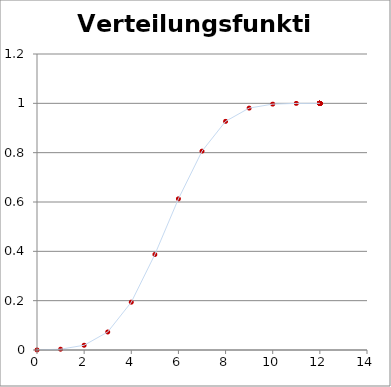
| Category | Verteilungsfunktion |
|---|---|
| 0.0 | 0 |
| 1.0 | 0.003 |
| 2.0 | 0.019 |
| 3.0 | 0.073 |
| 4.0 | 0.194 |
| 5.0 | 0.387 |
| 6.0 | 0.613 |
| 7.0 | 0.806 |
| 8.0 | 0.927 |
| 9.0 | 0.981 |
| 10.0 | 0.997 |
| 11.0 | 1 |
| 12.0 | 1 |
| 12.0 | 1 |
| 12.0 | 1 |
| 12.0 | 1 |
| 12.0 | 1 |
| 12.0 | 1 |
| 12.0 | 1 |
| 12.0 | 1 |
| 12.0 | 1 |
| 12.0 | 1 |
| 12.0 | 1 |
| 12.0 | 1 |
| 12.0 | 1 |
| 12.0 | 1 |
| 12.0 | 1 |
| 12.0 | 1 |
| 12.0 | 1 |
| 12.0 | 1 |
| 12.0 | 1 |
| 12.0 | 1 |
| 12.0 | 1 |
| 12.0 | 1 |
| 12.0 | 1 |
| 12.0 | 1 |
| 12.0 | 1 |
| 12.0 | 1 |
| 12.0 | 1 |
| 12.0 | 1 |
| 12.0 | 1 |
| 12.0 | 1 |
| 12.0 | 1 |
| 12.0 | 1 |
| 12.0 | 1 |
| 12.0 | 1 |
| 12.0 | 1 |
| 12.0 | 1 |
| 12.0 | 1 |
| 12.0 | 1 |
| 12.0 | 1 |
| 12.0 | 1 |
| 12.0 | 1 |
| 12.0 | 1 |
| 12.0 | 1 |
| 12.0 | 1 |
| 12.0 | 1 |
| 12.0 | 1 |
| 12.0 | 1 |
| 12.0 | 1 |
| 12.0 | 1 |
| 12.0 | 1 |
| 12.0 | 1 |
| 12.0 | 1 |
| 12.0 | 1 |
| 12.0 | 1 |
| 12.0 | 1 |
| 12.0 | 1 |
| 12.0 | 1 |
| 12.0 | 1 |
| 12.0 | 1 |
| 12.0 | 1 |
| 12.0 | 1 |
| 12.0 | 1 |
| 12.0 | 1 |
| 12.0 | 1 |
| 12.0 | 1 |
| 12.0 | 1 |
| 12.0 | 1 |
| 12.0 | 1 |
| 12.0 | 1 |
| 12.0 | 1 |
| 12.0 | 1 |
| 12.0 | 1 |
| 12.0 | 1 |
| 12.0 | 1 |
| 12.0 | 1 |
| 12.0 | 1 |
| 12.0 | 1 |
| 12.0 | 1 |
| 12.0 | 1 |
| 12.0 | 1 |
| 12.0 | 1 |
| 12.0 | 1 |
| 12.0 | 1 |
| 12.0 | 1 |
| 12.0 | 1 |
| 12.0 | 1 |
| 12.0 | 1 |
| 12.0 | 1 |
| 12.0 | 1 |
| 12.0 | 1 |
| 12.0 | 1 |
| 12.0 | 1 |
| 12.0 | 1 |
| 12.0 | 1 |
| 12.0 | 1 |
| 12.0 | 1 |
| 12.0 | 1 |
| 12.0 | 1 |
| 12.0 | 1 |
| 12.0 | 1 |
| 12.0 | 1 |
| 12.0 | 1 |
| 12.0 | 1 |
| 12.0 | 1 |
| 12.0 | 1 |
| 12.0 | 1 |
| 12.0 | 1 |
| 12.0 | 1 |
| 12.0 | 1 |
| 12.0 | 1 |
| 12.0 | 1 |
| 12.0 | 1 |
| 12.0 | 1 |
| 12.0 | 1 |
| 12.0 | 1 |
| 12.0 | 1 |
| 12.0 | 1 |
| 12.0 | 1 |
| 12.0 | 1 |
| 12.0 | 1 |
| 12.0 | 1 |
| 12.0 | 1 |
| 12.0 | 1 |
| 12.0 | 1 |
| 12.0 | 1 |
| 12.0 | 1 |
| 12.0 | 1 |
| 12.0 | 1 |
| 12.0 | 1 |
| 12.0 | 1 |
| 12.0 | 1 |
| 12.0 | 1 |
| 12.0 | 1 |
| 12.0 | 1 |
| 12.0 | 1 |
| 12.0 | 1 |
| 12.0 | 1 |
| 12.0 | 1 |
| 12.0 | 1 |
| 12.0 | 1 |
| 12.0 | 1 |
| 12.0 | 1 |
| 12.0 | 1 |
| 12.0 | 1 |
| 12.0 | 1 |
| 12.0 | 1 |
| 12.0 | 1 |
| 12.0 | 1 |
| 12.0 | 1 |
| 12.0 | 1 |
| 12.0 | 1 |
| 12.0 | 1 |
| 12.0 | 1 |
| 12.0 | 1 |
| 12.0 | 1 |
| 12.0 | 1 |
| 12.0 | 1 |
| 12.0 | 1 |
| 12.0 | 1 |
| 12.0 | 1 |
| 12.0 | 1 |
| 12.0 | 1 |
| 12.0 | 1 |
| 12.0 | 1 |
| 12.0 | 1 |
| 12.0 | 1 |
| 12.0 | 1 |
| 12.0 | 1 |
| 12.0 | 1 |
| 12.0 | 1 |
| 12.0 | 1 |
| 12.0 | 1 |
| 12.0 | 1 |
| 12.0 | 1 |
| 12.0 | 1 |
| 12.0 | 1 |
| 12.0 | 1 |
| 12.0 | 1 |
| 12.0 | 1 |
| 12.0 | 1 |
| 12.0 | 1 |
| 12.0 | 1 |
| 12.0 | 1 |
| 12.0 | 1 |
| 12.0 | 1 |
| 12.0 | 1 |
| 12.0 | 1 |
| 12.0 | 1 |
| 12.0 | 1 |
| 12.0 | 1 |
| 12.0 | 1 |
| 12.0 | 1 |
| 12.0 | 1 |
| 12.0 | 1 |
| 12.0 | 1 |
| 12.0 | 1 |
| 12.0 | 1 |
| 12.0 | 1 |
| 12.0 | 1 |
| 12.0 | 1 |
| 12.0 | 1 |
| 12.0 | 1 |
| 12.0 | 1 |
| 12.0 | 1 |
| 12.0 | 1 |
| 12.0 | 1 |
| 12.0 | 1 |
| 12.0 | 1 |
| 12.0 | 1 |
| 12.0 | 1 |
| 12.0 | 1 |
| 12.0 | 1 |
| 12.0 | 1 |
| 12.0 | 1 |
| 12.0 | 1 |
| 12.0 | 1 |
| 12.0 | 1 |
| 12.0 | 1 |
| 12.0 | 1 |
| 12.0 | 1 |
| 12.0 | 1 |
| 12.0 | 1 |
| 12.0 | 1 |
| 12.0 | 1 |
| 12.0 | 1 |
| 12.0 | 1 |
| 12.0 | 1 |
| 12.0 | 1 |
| 12.0 | 1 |
| 12.0 | 1 |
| 12.0 | 1 |
| 12.0 | 1 |
| 12.0 | 1 |
| 12.0 | 1 |
| 12.0 | 1 |
| 12.0 | 1 |
| 12.0 | 1 |
| 12.0 | 1 |
| 12.0 | 1 |
| 12.0 | 1 |
| 12.0 | 1 |
| 12.0 | 1 |
| 12.0 | 1 |
| 12.0 | 1 |
| 12.0 | 1 |
| 12.0 | 1 |
| 12.0 | 1 |
| 12.0 | 1 |
| 12.0 | 1 |
| 12.0 | 1 |
| 12.0 | 1 |
| 12.0 | 1 |
| 12.0 | 1 |
| 12.0 | 1 |
| 12.0 | 1 |
| 12.0 | 1 |
| 12.0 | 1 |
| 12.0 | 1 |
| 12.0 | 1 |
| 12.0 | 1 |
| 12.0 | 1 |
| 12.0 | 1 |
| 12.0 | 1 |
| 12.0 | 1 |
| 12.0 | 1 |
| 12.0 | 1 |
| 12.0 | 1 |
| 12.0 | 1 |
| 12.0 | 1 |
| 12.0 | 1 |
| 12.0 | 1 |
| 12.0 | 1 |
| 12.0 | 1 |
| 12.0 | 1 |
| 12.0 | 1 |
| 12.0 | 1 |
| 12.0 | 1 |
| 12.0 | 1 |
| 12.0 | 1 |
| 12.0 | 1 |
| 12.0 | 1 |
| 12.0 | 1 |
| 12.0 | 1 |
| 12.0 | 1 |
| 12.0 | 1 |
| 12.0 | 1 |
| 12.0 | 1 |
| 12.0 | 1 |
| 12.0 | 1 |
| 12.0 | 1 |
| 12.0 | 1 |
| 12.0 | 1 |
| 12.0 | 1 |
| 12.0 | 1 |
| 12.0 | 1 |
| 12.0 | 1 |
| 12.0 | 1 |
| 12.0 | 1 |
| 12.0 | 1 |
| 12.0 | 1 |
| 12.0 | 1 |
| 12.0 | 1 |
| 12.0 | 1 |
| 12.0 | 1 |
| 12.0 | 1 |
| 12.0 | 1 |
| 12.0 | 1 |
| 12.0 | 1 |
| 12.0 | 1 |
| 12.0 | 1 |
| 12.0 | 1 |
| 12.0 | 1 |
| 12.0 | 1 |
| 12.0 | 1 |
| 12.0 | 1 |
| 12.0 | 1 |
| 12.0 | 1 |
| 12.0 | 1 |
| 12.0 | 1 |
| 12.0 | 1 |
| 12.0 | 1 |
| 12.0 | 1 |
| 12.0 | 1 |
| 12.0 | 1 |
| 12.0 | 1 |
| 12.0 | 1 |
| 12.0 | 1 |
| 12.0 | 1 |
| 12.0 | 1 |
| 12.0 | 1 |
| 12.0 | 1 |
| 12.0 | 1 |
| 12.0 | 1 |
| 12.0 | 1 |
| 12.0 | 1 |
| 12.0 | 1 |
| 12.0 | 1 |
| 12.0 | 1 |
| 12.0 | 1 |
| 12.0 | 1 |
| 12.0 | 1 |
| 12.0 | 1 |
| 12.0 | 1 |
| 12.0 | 1 |
| 12.0 | 1 |
| 12.0 | 1 |
| 12.0 | 1 |
| 12.0 | 1 |
| 12.0 | 1 |
| 12.0 | 1 |
| 12.0 | 1 |
| 12.0 | 1 |
| 12.0 | 1 |
| 12.0 | 1 |
| 12.0 | 1 |
| 12.0 | 1 |
| 12.0 | 1 |
| 12.0 | 1 |
| 12.0 | 1 |
| 12.0 | 1 |
| 12.0 | 1 |
| 12.0 | 1 |
| 12.0 | 1 |
| 12.0 | 1 |
| 12.0 | 1 |
| 12.0 | 1 |
| 12.0 | 1 |
| 12.0 | 1 |
| 12.0 | 1 |
| 12.0 | 1 |
| 12.0 | 1 |
| 12.0 | 1 |
| 12.0 | 1 |
| 12.0 | 1 |
| 12.0 | 1 |
| 12.0 | 1 |
| 12.0 | 1 |
| 12.0 | 1 |
| 12.0 | 1 |
| 12.0 | 1 |
| 12.0 | 1 |
| 12.0 | 1 |
| 12.0 | 1 |
| 12.0 | 1 |
| 12.0 | 1 |
| 12.0 | 1 |
| 12.0 | 1 |
| 12.0 | 1 |
| 12.0 | 1 |
| 12.0 | 1 |
| 12.0 | 1 |
| 12.0 | 1 |
| 12.0 | 1 |
| 12.0 | 1 |
| 12.0 | 1 |
| 12.0 | 1 |
| 12.0 | 1 |
| 12.0 | 1 |
| 12.0 | 1 |
| 12.0 | 1 |
| 12.0 | 1 |
| 12.0 | 1 |
| 12.0 | 1 |
| 12.0 | 1 |
| 12.0 | 1 |
| 12.0 | 1 |
| 12.0 | 1 |
| 12.0 | 1 |
| 12.0 | 1 |
| 12.0 | 1 |
| 12.0 | 1 |
| 12.0 | 1 |
| 12.0 | 1 |
| 12.0 | 1 |
| 12.0 | 1 |
| 12.0 | 1 |
| 12.0 | 1 |
| 12.0 | 1 |
| 12.0 | 1 |
| 12.0 | 1 |
| 12.0 | 1 |
| 12.0 | 1 |
| 12.0 | 1 |
| 12.0 | 1 |
| 12.0 | 1 |
| 12.0 | 1 |
| 12.0 | 1 |
| 12.0 | 1 |
| 12.0 | 1 |
| 12.0 | 1 |
| 12.0 | 1 |
| 12.0 | 1 |
| 12.0 | 1 |
| 12.0 | 1 |
| 12.0 | 1 |
| 12.0 | 1 |
| 12.0 | 1 |
| 12.0 | 1 |
| 12.0 | 1 |
| 12.0 | 1 |
| 12.0 | 1 |
| 12.0 | 1 |
| 12.0 | 1 |
| 12.0 | 1 |
| 12.0 | 1 |
| 12.0 | 1 |
| 12.0 | 1 |
| 12.0 | 1 |
| 12.0 | 1 |
| 12.0 | 1 |
| 12.0 | 1 |
| 12.0 | 1 |
| 12.0 | 1 |
| 12.0 | 1 |
| 12.0 | 1 |
| 12.0 | 1 |
| 12.0 | 1 |
| 12.0 | 1 |
| 12.0 | 1 |
| 12.0 | 1 |
| 12.0 | 1 |
| 12.0 | 1 |
| 12.0 | 1 |
| 12.0 | 1 |
| 12.0 | 1 |
| 12.0 | 1 |
| 12.0 | 1 |
| 12.0 | 1 |
| 12.0 | 1 |
| 12.0 | 1 |
| 12.0 | 1 |
| 12.0 | 1 |
| 12.0 | 1 |
| 12.0 | 1 |
| 12.0 | 1 |
| 12.0 | 1 |
| 12.0 | 1 |
| 12.0 | 1 |
| 12.0 | 1 |
| 12.0 | 1 |
| 12.0 | 1 |
| 12.0 | 1 |
| 12.0 | 1 |
| 12.0 | 1 |
| 12.0 | 1 |
| 12.0 | 1 |
| 12.0 | 1 |
| 12.0 | 1 |
| 12.0 | 1 |
| 12.0 | 1 |
| 12.0 | 1 |
| 12.0 | 1 |
| 12.0 | 1 |
| 12.0 | 1 |
| 12.0 | 1 |
| 12.0 | 1 |
| 12.0 | 1 |
| 12.0 | 1 |
| 12.0 | 1 |
| 12.0 | 1 |
| 12.0 | 1 |
| 12.0 | 1 |
| 12.0 | 1 |
| 12.0 | 1 |
| 12.0 | 1 |
| 12.0 | 1 |
| 12.0 | 1 |
| 12.0 | 1 |
| 12.0 | 1 |
| 12.0 | 1 |
| 12.0 | 1 |
| 12.0 | 1 |
| 12.0 | 1 |
| 12.0 | 1 |
| 12.0 | 1 |
| 12.0 | 1 |
| 12.0 | 1 |
| 12.0 | 1 |
| 12.0 | 1 |
| 12.0 | 1 |
| 12.0 | 1 |
| 12.0 | 1 |
| 12.0 | 1 |
| 12.0 | 1 |
| 12.0 | 1 |
| 12.0 | 1 |
| 12.0 | 1 |
| 12.0 | 1 |
| 12.0 | 1 |
| 12.0 | 1 |
| 12.0 | 1 |
| 12.0 | 1 |
| 12.0 | 1 |
| 12.0 | 1 |
| 12.0 | 1 |
| 12.0 | 1 |
| 12.0 | 1 |
| 12.0 | 1 |
| 12.0 | 1 |
| 12.0 | 1 |
| 12.0 | 1 |
| 12.0 | 1 |
| 12.0 | 1 |
| 12.0 | 1 |
| 12.0 | 1 |
| 12.0 | 1 |
| 12.0 | 1 |
| 12.0 | 1 |
| 12.0 | 1 |
| 12.0 | 1 |
| 12.0 | 1 |
| 12.0 | 1 |
| 12.0 | 1 |
| 12.0 | 1 |
| 12.0 | 1 |
| 12.0 | 1 |
| 12.0 | 1 |
| 12.0 | 1 |
| 12.0 | 1 |
| 12.0 | 1 |
| 12.0 | 1 |
| 12.0 | 1 |
| 12.0 | 1 |
| 12.0 | 1 |
| 12.0 | 1 |
| 12.0 | 1 |
| 12.0 | 1 |
| 12.0 | 1 |
| 12.0 | 1 |
| 12.0 | 1 |
| 12.0 | 1 |
| 12.0 | 1 |
| 12.0 | 1 |
| 12.0 | 1 |
| 12.0 | 1 |
| 12.0 | 1 |
| 12.0 | 1 |
| 12.0 | 1 |
| 12.0 | 1 |
| 12.0 | 1 |
| 12.0 | 1 |
| 12.0 | 1 |
| 12.0 | 1 |
| 12.0 | 1 |
| 12.0 | 1 |
| 12.0 | 1 |
| 12.0 | 1 |
| 12.0 | 1 |
| 12.0 | 1 |
| 12.0 | 1 |
| 12.0 | 1 |
| 12.0 | 1 |
| 12.0 | 1 |
| 12.0 | 1 |
| 12.0 | 1 |
| 12.0 | 1 |
| 12.0 | 1 |
| 12.0 | 1 |
| 12.0 | 1 |
| 12.0 | 1 |
| 12.0 | 1 |
| 12.0 | 1 |
| 12.0 | 1 |
| 12.0 | 1 |
| 12.0 | 1 |
| 12.0 | 1 |
| 12.0 | 1 |
| 12.0 | 1 |
| 12.0 | 1 |
| 12.0 | 1 |
| 12.0 | 1 |
| 12.0 | 1 |
| 12.0 | 1 |
| 12.0 | 1 |
| 12.0 | 1 |
| 12.0 | 1 |
| 12.0 | 1 |
| 12.0 | 1 |
| 12.0 | 1 |
| 12.0 | 1 |
| 12.0 | 1 |
| 12.0 | 1 |
| 12.0 | 1 |
| 12.0 | 1 |
| 12.0 | 1 |
| 12.0 | 1 |
| 12.0 | 1 |
| 12.0 | 1 |
| 12.0 | 1 |
| 12.0 | 1 |
| 12.0 | 1 |
| 12.0 | 1 |
| 12.0 | 1 |
| 12.0 | 1 |
| 12.0 | 1 |
| 12.0 | 1 |
| 12.0 | 1 |
| 12.0 | 1 |
| 12.0 | 1 |
| 12.0 | 1 |
| 12.0 | 1 |
| 12.0 | 1 |
| 12.0 | 1 |
| 12.0 | 1 |
| 12.0 | 1 |
| 12.0 | 1 |
| 12.0 | 1 |
| 12.0 | 1 |
| 12.0 | 1 |
| 12.0 | 1 |
| 12.0 | 1 |
| 12.0 | 1 |
| 12.0 | 1 |
| 12.0 | 1 |
| 12.0 | 1 |
| 12.0 | 1 |
| 12.0 | 1 |
| 12.0 | 1 |
| 12.0 | 1 |
| 12.0 | 1 |
| 12.0 | 1 |
| 12.0 | 1 |
| 12.0 | 1 |
| 12.0 | 1 |
| 12.0 | 1 |
| 12.0 | 1 |
| 12.0 | 1 |
| 12.0 | 1 |
| 12.0 | 1 |
| 12.0 | 1 |
| 12.0 | 1 |
| 12.0 | 1 |
| 12.0 | 1 |
| 12.0 | 1 |
| 12.0 | 1 |
| 12.0 | 1 |
| 12.0 | 1 |
| 12.0 | 1 |
| 12.0 | 1 |
| 12.0 | 1 |
| 12.0 | 1 |
| 12.0 | 1 |
| 12.0 | 1 |
| 12.0 | 1 |
| 12.0 | 1 |
| 12.0 | 1 |
| 12.0 | 1 |
| 12.0 | 1 |
| 12.0 | 1 |
| 12.0 | 1 |
| 12.0 | 1 |
| 12.0 | 1 |
| 12.0 | 1 |
| 12.0 | 1 |
| 12.0 | 1 |
| 12.0 | 1 |
| 12.0 | 1 |
| 12.0 | 1 |
| 12.0 | 1 |
| 12.0 | 1 |
| 12.0 | 1 |
| 12.0 | 1 |
| 12.0 | 1 |
| 12.0 | 1 |
| 12.0 | 1 |
| 12.0 | 1 |
| 12.0 | 1 |
| 12.0 | 1 |
| 12.0 | 1 |
| 12.0 | 1 |
| 12.0 | 1 |
| 12.0 | 1 |
| 12.0 | 1 |
| 12.0 | 1 |
| 12.0 | 1 |
| 12.0 | 1 |
| 12.0 | 1 |
| 12.0 | 1 |
| 12.0 | 1 |
| 12.0 | 1 |
| 12.0 | 1 |
| 12.0 | 1 |
| 12.0 | 1 |
| 12.0 | 1 |
| 12.0 | 1 |
| 12.0 | 1 |
| 12.0 | 1 |
| 12.0 | 1 |
| 12.0 | 1 |
| 12.0 | 1 |
| 12.0 | 1 |
| 12.0 | 1 |
| 12.0 | 1 |
| 12.0 | 1 |
| 12.0 | 1 |
| 12.0 | 1 |
| 12.0 | 1 |
| 12.0 | 1 |
| 12.0 | 1 |
| 12.0 | 1 |
| 12.0 | 1 |
| 12.0 | 1 |
| 12.0 | 1 |
| 12.0 | 1 |
| 12.0 | 1 |
| 12.0 | 1 |
| 12.0 | 1 |
| 12.0 | 1 |
| 12.0 | 1 |
| 12.0 | 1 |
| 12.0 | 1 |
| 12.0 | 1 |
| 12.0 | 1 |
| 12.0 | 1 |
| 12.0 | 1 |
| 12.0 | 1 |
| 12.0 | 1 |
| 12.0 | 1 |
| 12.0 | 1 |
| 12.0 | 1 |
| 12.0 | 1 |
| 12.0 | 1 |
| 12.0 | 1 |
| 12.0 | 1 |
| 12.0 | 1 |
| 12.0 | 1 |
| 12.0 | 1 |
| 12.0 | 1 |
| 12.0 | 1 |
| 12.0 | 1 |
| 12.0 | 1 |
| 12.0 | 1 |
| 12.0 | 1 |
| 12.0 | 1 |
| 12.0 | 1 |
| 12.0 | 1 |
| 12.0 | 1 |
| 12.0 | 1 |
| 12.0 | 1 |
| 12.0 | 1 |
| 12.0 | 1 |
| 12.0 | 1 |
| 12.0 | 1 |
| 12.0 | 1 |
| 12.0 | 1 |
| 12.0 | 1 |
| 12.0 | 1 |
| 12.0 | 1 |
| 12.0 | 1 |
| 12.0 | 1 |
| 12.0 | 1 |
| 12.0 | 1 |
| 12.0 | 1 |
| 12.0 | 1 |
| 12.0 | 1 |
| 12.0 | 1 |
| 12.0 | 1 |
| 12.0 | 1 |
| 12.0 | 1 |
| 12.0 | 1 |
| 12.0 | 1 |
| 12.0 | 1 |
| 12.0 | 1 |
| 12.0 | 1 |
| 12.0 | 1 |
| 12.0 | 1 |
| 12.0 | 1 |
| 12.0 | 1 |
| 12.0 | 1 |
| 12.0 | 1 |
| 12.0 | 1 |
| 12.0 | 1 |
| 12.0 | 1 |
| 12.0 | 1 |
| 12.0 | 1 |
| 12.0 | 1 |
| 12.0 | 1 |
| 12.0 | 1 |
| 12.0 | 1 |
| 12.0 | 1 |
| 12.0 | 1 |
| 12.0 | 1 |
| 12.0 | 1 |
| 12.0 | 1 |
| 12.0 | 1 |
| 12.0 | 1 |
| 12.0 | 1 |
| 12.0 | 1 |
| 12.0 | 1 |
| 12.0 | 1 |
| 12.0 | 1 |
| 12.0 | 1 |
| 12.0 | 1 |
| 12.0 | 1 |
| 12.0 | 1 |
| 12.0 | 1 |
| 12.0 | 1 |
| 12.0 | 1 |
| 12.0 | 1 |
| 12.0 | 1 |
| 12.0 | 1 |
| 12.0 | 1 |
| 12.0 | 1 |
| 12.0 | 1 |
| 12.0 | 1 |
| 12.0 | 1 |
| 12.0 | 1 |
| 12.0 | 1 |
| 12.0 | 1 |
| 12.0 | 1 |
| 12.0 | 1 |
| 12.0 | 1 |
| 12.0 | 1 |
| 12.0 | 1 |
| 12.0 | 1 |
| 12.0 | 1 |
| 12.0 | 1 |
| 12.0 | 1 |
| 12.0 | 1 |
| 12.0 | 1 |
| 12.0 | 1 |
| 12.0 | 1 |
| 12.0 | 1 |
| 12.0 | 1 |
| 12.0 | 1 |
| 12.0 | 1 |
| 12.0 | 1 |
| 12.0 | 1 |
| 12.0 | 1 |
| 12.0 | 1 |
| 12.0 | 1 |
| 12.0 | 1 |
| 12.0 | 1 |
| 12.0 | 1 |
| 12.0 | 1 |
| 12.0 | 1 |
| 12.0 | 1 |
| 12.0 | 1 |
| 12.0 | 1 |
| 12.0 | 1 |
| 12.0 | 1 |
| 12.0 | 1 |
| 12.0 | 1 |
| 12.0 | 1 |
| 12.0 | 1 |
| 12.0 | 1 |
| 12.0 | 1 |
| 12.0 | 1 |
| 12.0 | 1 |
| 12.0 | 1 |
| 12.0 | 1 |
| 12.0 | 1 |
| 12.0 | 1 |
| 12.0 | 1 |
| 12.0 | 1 |
| 12.0 | 1 |
| 12.0 | 1 |
| 12.0 | 1 |
| 12.0 | 1 |
| 12.0 | 1 |
| 12.0 | 1 |
| 12.0 | 1 |
| 12.0 | 1 |
| 12.0 | 1 |
| 12.0 | 1 |
| 12.0 | 1 |
| 12.0 | 1 |
| 12.0 | 1 |
| 12.0 | 1 |
| 12.0 | 1 |
| 12.0 | 1 |
| 12.0 | 1 |
| 12.0 | 1 |
| 12.0 | 1 |
| 12.0 | 1 |
| 12.0 | 1 |
| 12.0 | 1 |
| 12.0 | 1 |
| 12.0 | 1 |
| 12.0 | 1 |
| 12.0 | 1 |
| 12.0 | 1 |
| 12.0 | 1 |
| 12.0 | 1 |
| 12.0 | 1 |
| 12.0 | 1 |
| 12.0 | 1 |
| 12.0 | 1 |
| 12.0 | 1 |
| 12.0 | 1 |
| 12.0 | 1 |
| 12.0 | 1 |
| 12.0 | 1 |
| 12.0 | 1 |
| 12.0 | 1 |
| 12.0 | 1 |
| 12.0 | 1 |
| 12.0 | 1 |
| 12.0 | 1 |
| 12.0 | 1 |
| 12.0 | 1 |
| 12.0 | 1 |
| 12.0 | 1 |
| 12.0 | 1 |
| 12.0 | 1 |
| 12.0 | 1 |
| 12.0 | 1 |
| 12.0 | 1 |
| 12.0 | 1 |
| 12.0 | 1 |
| 12.0 | 1 |
| 12.0 | 1 |
| 12.0 | 1 |
| 12.0 | 1 |
| 12.0 | 1 |
| 12.0 | 1 |
| 12.0 | 1 |
| 12.0 | 1 |
| 12.0 | 1 |
| 12.0 | 1 |
| 12.0 | 1 |
| 12.0 | 1 |
| 12.0 | 1 |
| 12.0 | 1 |
| 12.0 | 1 |
| 12.0 | 1 |
| 12.0 | 1 |
| 12.0 | 1 |
| 12.0 | 1 |
| 12.0 | 1 |
| 12.0 | 1 |
| 12.0 | 1 |
| 12.0 | 1 |
| 12.0 | 1 |
| 12.0 | 1 |
| 12.0 | 1 |
| 12.0 | 1 |
| 12.0 | 1 |
| 12.0 | 1 |
| 12.0 | 1 |
| 12.0 | 1 |
| 12.0 | 1 |
| 12.0 | 1 |
| 12.0 | 1 |
| 12.0 | 1 |
| 12.0 | 1 |
| 12.0 | 1 |
| 12.0 | 1 |
| 12.0 | 1 |